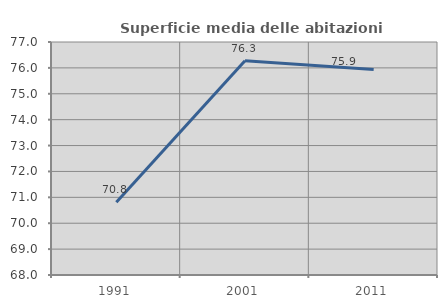
| Category | Superficie media delle abitazioni occupate |
|---|---|
| 1991.0 | 70.808 |
| 2001.0 | 76.273 |
| 2011.0 | 75.94 |